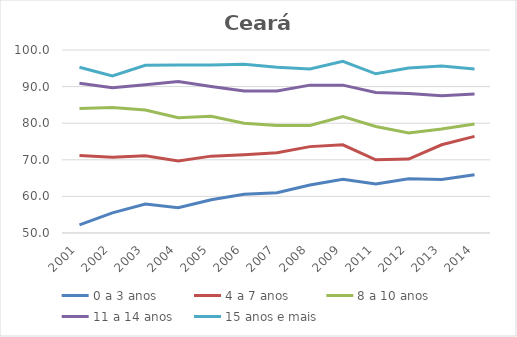
| Category | 0 a 3 anos | 4 a 7 anos | 8 a 10 anos | 11 a 14 anos | 15 anos e mais |
|---|---|---|---|---|---|
| 2001.0 | 52.2 | 71.2 | 84 | 90.9 | 95.3 |
| 2002.0 | 55.5 | 70.7 | 84.3 | 89.7 | 92.9 |
| 2003.0 | 57.9 | 71.1 | 83.6 | 90.5 | 95.8 |
| 2004.0 | 56.9 | 69.7 | 81.5 | 91.4 | 95.9 |
| 2005.0 | 59.1 | 71 | 81.9 | 90 | 95.9 |
| 2006.0 | 60.6 | 71.4 | 80 | 88.8 | 96.1 |
| 2007.0 | 61 | 71.9 | 79.4 | 88.8 | 95.3 |
| 2008.0 | 63.1 | 73.6 | 79.4 | 90.4 | 94.8 |
| 2009.0 | 64.7 | 74.1 | 81.8 | 90.4 | 96.9 |
| 2011.0 | 63.4 | 70 | 79.1 | 88.4 | 93.5 |
| 2012.0 | 64.8 | 70.2 | 77.3 | 88.1 | 95.1 |
| 2013.0 | 64.6 | 74.1 | 78.4 | 87.5 | 95.6 |
| 2014.0 | 65.9 | 76.4 | 79.8 | 88 | 94.8 |